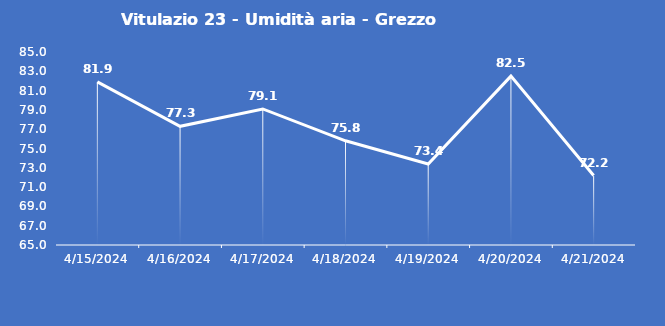
| Category | Vitulazio 23 - Umidità aria - Grezzo (%) |
|---|---|
| 4/15/24 | 81.9 |
| 4/16/24 | 77.3 |
| 4/17/24 | 79.1 |
| 4/18/24 | 75.8 |
| 4/19/24 | 73.4 |
| 4/20/24 | 82.5 |
| 4/21/24 | 72.2 |